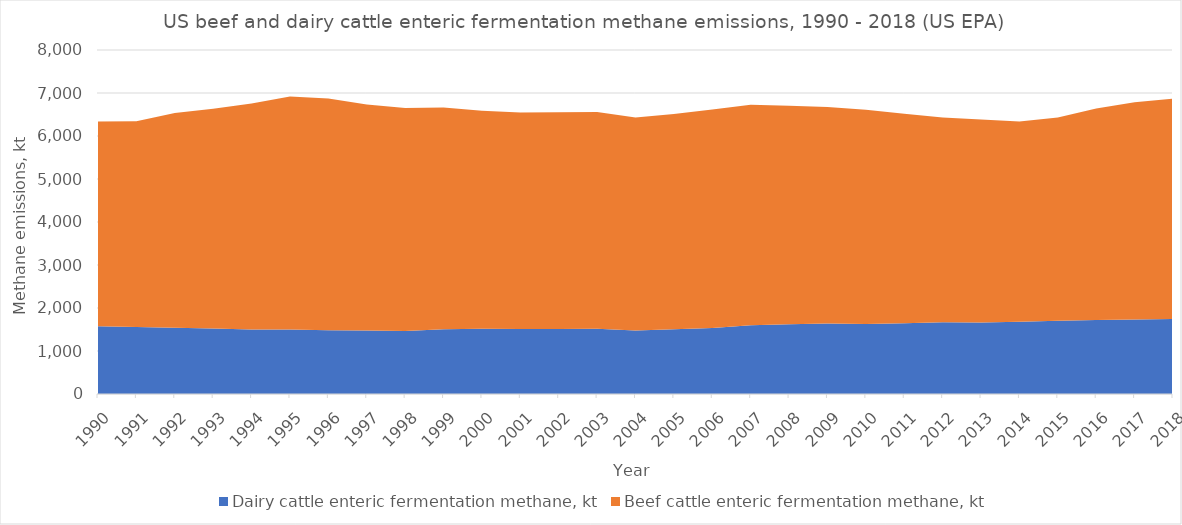
| Category | Dairy cattle enteric fermentation methane, kt | Beef cattle enteric fermentation methane, kt |
|---|---|---|
| 1990.0 | 1574 | 4763 |
| 1991.0 | 1559 | 4786 |
| 1992.0 | 1538 | 4999 |
| 1993.0 | 1526 | 5110 |
| 1994.0 | 1502 | 5253 |
| 1995.0 | 1498 | 5419 |
| 1996.0 | 1481 | 5393 |
| 1997.0 | 1475 | 5260 |
| 1998.0 | 1463 | 5191 |
| 1999.0 | 1503 | 5159 |
| 2000.0 | 1519 | 5070 |
| 2001.0 | 1509 | 5037 |
| 2002.0 | 1512 | 5040 |
| 2003.0 | 1520 | 5041 |
| 2004.0 | 1476 | 4956 |
| 2005.0 | 1503 | 5007 |
| 2006.0 | 1534 | 5081 |
| 2007.0 | 1601 | 5123 |
| 2008.0 | 1623 | 5078 |
| 2009.0 | 1639 | 5034 |
| 2010.0 | 1627 | 4984 |
| 2011.0 | 1645 | 4873 |
| 2012.0 | 1670 | 4763 |
| 2013.0 | 1664 | 4722 |
| 2014.0 | 1679 | 4660 |
| 2015.0 | 1706 | 4722 |
| 2016.0 | 1722 | 4919 |
| 2017.0 | 1730 | 5052 |
| 2018.0 | 1744 | 5125 |